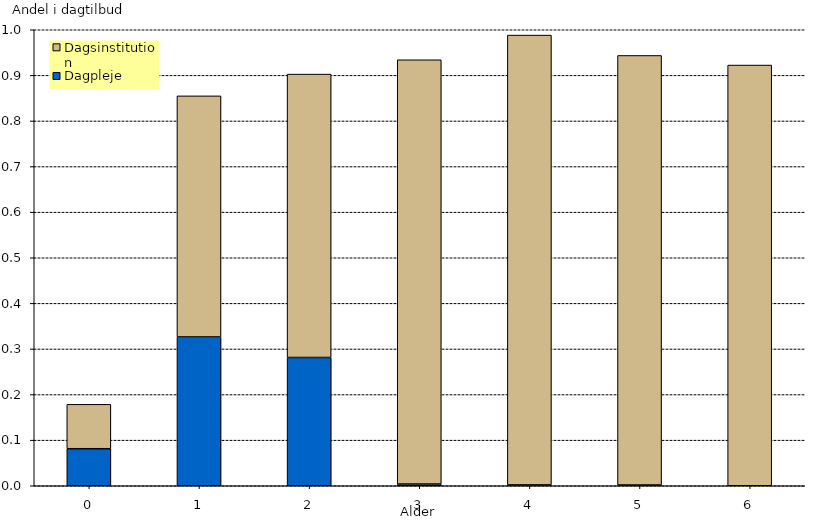
| Category | Dagpleje | Dagsinstitution |
|---|---|---|
| 0.0 | 0.081 | 0.097 |
| 1.0 | 0.326 | 0.529 |
| 2.0 | 0.281 | 0.622 |
| 3.0 | 0.004 | 0.93 |
| 4.0 | 0.002 | 0.986 |
| 5.0 | 0.002 | 0.942 |
| 6.0 | 0 | 0.923 |